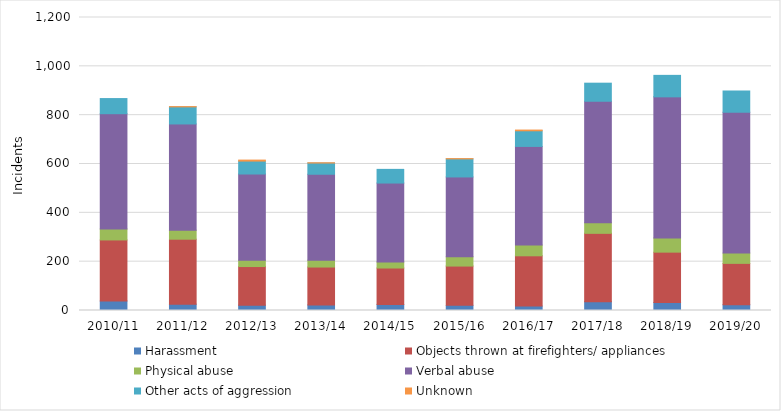
| Category | Harassment | Objects thrown at firefighters/ appliances | Physical abuse | Verbal abuse | Other acts of aggression | Unknown |
|---|---|---|---|---|---|---|
| 2010/11 | 39 | 250 | 45 | 472 | 62 | 0 |
| 2011/12 | 26 | 266 | 37 | 435 | 70 | 1 |
| 2012/13 | 22 | 158 | 26 | 353 | 53 | 4 |
| 2013/14 | 23 | 155 | 28 | 352 | 46 | 1 |
| 2014/15 | 25 | 149 | 25 | 323 | 56 | 0 |
| 2015/16 | 21 | 161 | 38 | 327 | 74 | 1 |
| 2016/17 | 18 | 206 | 44 | 404 | 64 | 3 |
| 2017/18 | 36 | 280 | 43 | 498 | 74 | 0 |
| 2018/19 | 33 | 206 | 58 | 578 | 88 | 0 |
| 2019/20 | 24 | 169 | 42 | 577 | 87 | 0 |